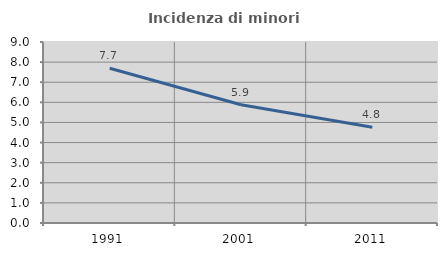
| Category | Incidenza di minori stranieri |
|---|---|
| 1991.0 | 7.692 |
| 2001.0 | 5.882 |
| 2011.0 | 4.762 |